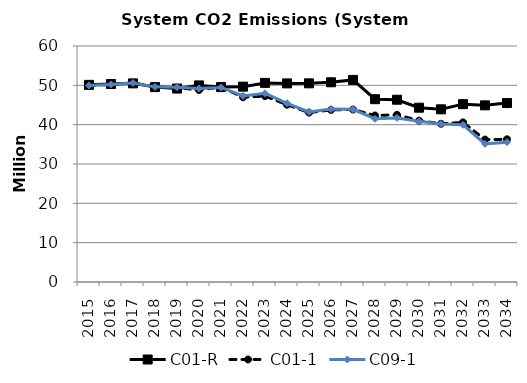
| Category | C01-R | C01-1 | C09-1 |
|---|---|---|---|
| 2015.0 | 50.118 | 49.98 | 49.973 |
| 2016.0 | 50.329 | 50.239 | 50.225 |
| 2017.0 | 50.499 | 50.623 | 50.6 |
| 2018.0 | 49.555 | 49.637 | 49.612 |
| 2019.0 | 49.181 | 49.422 | 49.523 |
| 2020.0 | 49.976 | 48.827 | 49.201 |
| 2021.0 | 49.548 | 49.578 | 49.462 |
| 2022.0 | 49.671 | 46.971 | 47.309 |
| 2023.0 | 50.618 | 47.262 | 47.971 |
| 2024.0 | 50.491 | 45.086 | 45.437 |
| 2025.0 | 50.508 | 43.063 | 43.229 |
| 2026.0 | 50.777 | 43.764 | 43.979 |
| 2027.0 | 51.38 | 43.847 | 43.917 |
| 2028.0 | 46.481 | 42.329 | 41.487 |
| 2029.0 | 46.342 | 42.511 | 41.717 |
| 2030.0 | 44.317 | 41.021 | 40.844 |
| 2031.0 | 43.901 | 40.228 | 40.197 |
| 2032.0 | 45.215 | 40.585 | 39.962 |
| 2033.0 | 44.915 | 36.207 | 35.121 |
| 2034.0 | 45.496 | 36.272 | 35.55 |